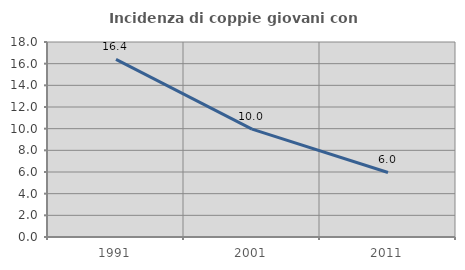
| Category | Incidenza di coppie giovani con figli |
|---|---|
| 1991.0 | 16.401 |
| 2001.0 | 9.963 |
| 2011.0 | 5.957 |